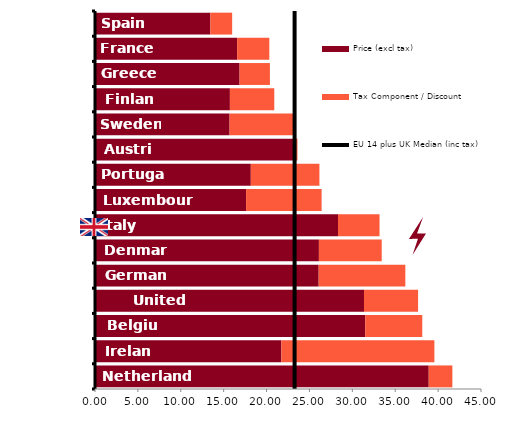
| Category | Price (excl tax) | Tax Component / Discount |
|---|---|---|
| Netherlands | 38.908 | 2.754 |
| Ireland | 21.726 | 17.84 |
| Belgium | 31.505 | 6.648 |
| United Kingdom | 31.36 | 6.306 |
| Germany | 26.076 | 10.104 |
| Denmark | 26.102 | 7.324 |
| Italy | 28.33 | 4.842 |
| Luxembourg | 17.612 | 8.806 |
| Portugal | 18.165 | 7.999 |
| Austria | 23.269 | 0.333 |
| Sweden | 15.691 | 7.71 |
| Finland | 15.726 | 5.175 |
| Greece | 16.858 | 3.535 |
| France | 16.568 | 3.754 |
| Spain | 13.455 | 2.535 |